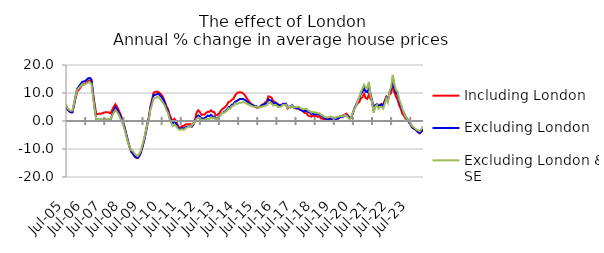
| Category | Including London | Excluding London | Excluding London & SE |
|---|---|---|---|
| 2005-07-01 | 4.961 | 5.238 | 5.911 |
| 2005-08-01 | 3.983 | 4.165 | 4.631 |
| 2005-09-01 | 3.417 | 3.557 | 3.947 |
| 2005-10-01 | 3.107 | 3.169 | 3.642 |
| 2005-11-01 | 3.09 | 3.138 | 3.754 |
| 2005-12-01 | 5.631 | 5.912 | 6.228 |
| 2006-01-01 | 8.047 | 8.723 | 8.703 |
| 2006-02-01 | 10.531 | 11.511 | 11.037 |
| 2006-03-01 | 11.111 | 12.268 | 11.779 |
| 2006-04-01 | 11.953 | 13.012 | 12.348 |
| 2006-05-01 | 12.81 | 13.886 | 13.071 |
| 2006-06-01 | 13.139 | 14.128 | 13.075 |
| 2006-07-01 | 13.316 | 14.248 | 13.034 |
| 2006-08-01 | 13.891 | 14.799 | 13.456 |
| 2006-09-01 | 14.422 | 15.268 | 13.757 |
| 2006-10-01 | 14.497 | 15.359 | 13.773 |
| 2006-11-01 | 14.217 | 14.846 | 13.163 |
| 2006-12-01 | 9.633 | 9.359 | 8.374 |
| 2007-01-01 | 5.843 | 4.658 | 4.228 |
| 2007-02-01 | 2.371 | 0.478 | 0.641 |
| 2007-03-01 | 2.541 | 0.476 | 0.638 |
| 2007-04-01 | 2.587 | 0.482 | 0.648 |
| 2007-05-01 | 2.618 | 0.401 | 0.538 |
| 2007-06-01 | 2.843 | 0.417 | 0.562 |
| 2007-07-01 | 3.018 | 0.44 | 0.592 |
| 2007-08-01 | 3.162 | 0.473 | 0.638 |
| 2007-09-01 | 3.123 | 0.508 | 0.685 |
| 2007-10-01 | 3.04 | 0.484 | 0.653 |
| 2007-11-01 | 2.731 | 0.467 | 0.63 |
| 2007-12-01 | 4.009 | 2.238 | 1.926 |
| 2008-01-01 | 5.111 | 3.72 | 2.966 |
| 2008-02-01 | 6.008 | 4.956 | 3.929 |
| 2008-03-01 | 5.062 | 4.111 | 3.191 |
| 2008-04-01 | 3.943 | 3.113 | 2.352 |
| 2008-05-01 | 2.718 | 2.031 | 1.061 |
| 2008-06-01 | 1.097 | 0.619 | -0.107 |
| 2008-07-01 | -0.669 | -0.966 | -1.674 |
| 2008-08-01 | -2.757 | -2.964 | -3.46 |
| 2008-09-01 | -5.107 | -5.234 | -5.785 |
| 2008-10-01 | -7.441 | -7.566 | -7.899 |
| 2008-11-01 | -9.365 | -9.436 | -9.334 |
| 2008-12-01 | -10.885 | -11.048 | -10.481 |
| 2009-01-01 | -11.686 | -11.713 | -10.732 |
| 2009-02-01 | -12.61 | -12.563 | -11.697 |
| 2009-03-01 | -13.113 | -12.985 | -12.081 |
| 2009-04-01 | -13.269 | -13.148 | -12.561 |
| 2009-05-01 | -12.458 | -12.504 | -11.709 |
| 2009-06-01 | -11.096 | -11.158 | -10.516 |
| 2009-07-01 | -9.065 | -9.217 | -8.438 |
| 2009-08-01 | -6.807 | -6.941 | -6.302 |
| 2009-09-01 | -3.958 | -4.403 | -3.826 |
| 2009-10-01 | -0.942 | -1.376 | -1.102 |
| 2009-11-01 | 1.492 | 0.851 | 0.811 |
| 2009-12-01 | 5.238 | 4.756 | 4.142 |
| 2010-01-01 | 7.6 | 6.892 | 5.896 |
| 2010-02-01 | 10.157 | 9.275 | 8.152 |
| 2010-03-01 | 10.383 | 9.338 | 8.09 |
| 2010-04-01 | 10.489 | 9.558 | 8.582 |
| 2010-05-01 | 10.304 | 9.745 | 8.51 |
| 2010-06-01 | 9.887 | 9.13 | 7.969 |
| 2010-07-01 | 9.322 | 8.534 | 7.107 |
| 2010-08-01 | 8.432 | 7.559 | 6.315 |
| 2010-09-01 | 6.942 | 6.459 | 5.519 |
| 2010-10-01 | 5.263 | 4.666 | 3.91 |
| 2010-11-01 | 4.29 | 3.595 | 2.833 |
| 2010-12-01 | 2.245 | 1.341 | 0.679 |
| 2011-01-01 | 0.943 | 0.139 | -0.7 |
| 2011-02-01 | 0.021 | -0.806 | -1.832 |
| 2011-03-01 | 0.776 | -0.159 | -1.462 |
| 2011-04-01 | 0.092 | -0.883 | -1.76 |
| 2011-05-01 | -1.322 | -2.106 | -2.603 |
| 2011-06-01 | -2.451 | -2.846 | -3.149 |
| 2011-07-01 | -2.22 | -2.722 | -3.048 |
| 2011-08-01 | -1.819 | -2.512 | -2.976 |
| 2011-09-01 | -1.748 | -2.698 | -3.144 |
| 2011-10-01 | -1.236 | -2.252 | -2.598 |
| 2011-11-01 | -1.165 | -2.037 | -2.305 |
| 2011-12-01 | -1.194 | -1.997 | -2.096 |
| 2012-01-01 | -1.114 | -1.839 | -1.752 |
| 2012-02-01 | -1.51 | -2.001 | -1.598 |
| 2012-03-01 | -0.734 | -1.199 | -0.879 |
| 2012-04-01 | 0.693 | -0.184 | -0.465 |
| 2012-05-01 | 3.084 | 1.477 | 0.825 |
| 2012-06-01 | 3.85 | 1.973 | 1.3 |
| 2012-07-01 | 3.186 | 1.548 | 0.902 |
| 2012-08-01 | 2.188 | 0.899 | 0.458 |
| 2012-09-01 | 2.287 | 0.848 | 0.314 |
| 2012-10-01 | 2.314 | 1.012 | 0.512 |
| 2012-11-01 | 2.964 | 1.433 | 0.649 |
| 2012-12-01 | 3.263 | 1.937 | 0.816 |
| 2013-01-01 | 3.304 | 1.69 | 0.666 |
| 2013-02-01 | 3.832 | 2.203 | 1.334 |
| 2013-03-01 | 3.309 | 1.513 | 0.881 |
| 2013-04-01 | 3.147 | 1.63 | 1.212 |
| 2013-05-01 | 2.036 | 0.802 | 0.341 |
| 2013-06-01 | 2.199 | 1.068 | 0.806 |
| 2013-07-01 | 2.706 | 1.585 | 1.428 |
| 2013-08-01 | 3.613 | 2.235 | 2.183 |
| 2013-09-01 | 4.156 | 2.841 | 2.862 |
| 2013-10-01 | 4.638 | 3.119 | 2.84 |
| 2013-11-01 | 5.082 | 3.557 | 3.337 |
| 2013-12-01 | 5.762 | 3.971 | 3.622 |
| 2014-01-01 | 6.864 | 4.935 | 4.562 |
| 2014-02-01 | 6.941 | 4.976 | 4.326 |
| 2014-03-01 | 7.589 | 5.79 | 5.291 |
| 2014-04-01 | 7.863 | 5.967 | 5.364 |
| 2014-05-01 | 9.071 | 6.809 | 6.281 |
| 2014-06-01 | 9.841 | 7.091 | 6.036 |
| 2014-07-01 | 10.166 | 7.457 | 6.269 |
| 2014-08-01 | 10.303 | 7.816 | 6.489 |
| 2014-09-01 | 10.199 | 7.888 | 6.526 |
| 2014-10-01 | 9.912 | 7.859 | 6.787 |
| 2014-11-01 | 9.415 | 7.653 | 6.555 |
| 2014-12-01 | 8.539 | 7.205 | 6.492 |
| 2015-01-01 | 7.563 | 6.721 | 5.968 |
| 2015-02-01 | 6.977 | 6.384 | 5.908 |
| 2015-03-01 | 6.141 | 5.885 | 5.405 |
| 2015-04-01 | 5.843 | 5.659 | 5.256 |
| 2015-05-01 | 5.247 | 5.442 | 5.069 |
| 2015-06-01 | 4.949 | 5.375 | 5.21 |
| 2015-07-01 | 4.72 | 5.094 | 5.064 |
| 2015-08-01 | 4.916 | 5.013 | 4.962 |
| 2015-09-01 | 5.129 | 5.186 | 4.86 |
| 2015-10-01 | 5.82 | 5.737 | 5.131 |
| 2015-11-01 | 5.994 | 5.839 | 5.242 |
| 2015-12-01 | 6.641 | 6.164 | 5.478 |
| 2016-01-01 | 6.987 | 6.279 | 5.608 |
| 2016-02-01 | 8.809 | 7.745 | 6.621 |
| 2016-03-01 | 8.655 | 7.375 | 6.347 |
| 2016-04-01 | 8.33 | 7.231 | 6.295 |
| 2016-05-01 | 7.031 | 6.181 | 5.532 |
| 2016-06-01 | 6.851 | 6.467 | 5.761 |
| 2016-07-01 | 6.508 | 6.312 | 5.507 |
| 2016-08-01 | 5.837 | 5.916 | 4.99 |
| 2016-09-01 | 5.675 | 5.641 | 4.92 |
| 2016-10-01 | 5.615 | 5.587 | 5.166 |
| 2016-11-01 | 6.128 | 5.942 | 5.697 |
| 2016-12-01 | 6.133 | 6.085 | 5.793 |
| 2017-01-01 | 6.071 | 6.183 | 5.786 |
| 2017-02-01 | 4.435 | 4.794 | 4.663 |
| 2017-03-01 | 4.886 | 5.168 | 5.096 |
| 2017-04-01 | 4.886 | 4.989 | 4.887 |
| 2017-05-01 | 5.598 | 5.647 | 5.495 |
| 2017-06-01 | 4.755 | 4.825 | 4.834 |
| 2017-07-01 | 4.54 | 4.697 | 4.927 |
| 2017-08-01 | 4.348 | 4.651 | 5.024 |
| 2017-09-01 | 4.425 | 4.644 | 5.173 |
| 2017-10-01 | 3.949 | 4.035 | 4.603 |
| 2017-11-01 | 3.765 | 3.749 | 4.433 |
| 2017-12-01 | 3.216 | 3.5 | 4.169 |
| 2018-01-01 | 2.903 | 3.574 | 4.28 |
| 2018-02-01 | 2.646 | 3.65 | 4.346 |
| 2018-03-01 | 1.913 | 3.141 | 3.752 |
| 2018-04-01 | 1.761 | 3.04 | 3.567 |
| 2018-05-01 | 1.539 | 2.47 | 2.965 |
| 2018-06-01 | 2.083 | 2.801 | 3.303 |
| 2018-07-01 | 1.713 | 2.387 | 2.966 |
| 2018-08-01 | 1.821 | 2.532 | 3.105 |
| 2018-09-01 | 1.449 | 2.259 | 2.714 |
| 2018-10-01 | 1.647 | 2.441 | 2.786 |
| 2018-11-01 | 0.913 | 1.937 | 2.192 |
| 2018-12-01 | 0.855 | 1.607 | 2.052 |
| 2019-01-01 | 0.572 | 1.041 | 1.499 |
| 2019-02-01 | 0.744 | 0.834 | 1.344 |
| 2019-03-01 | 0.702 | 0.675 | 1.225 |
| 2019-04-01 | 0.698 | 0.571 | 1.355 |
| 2019-05-01 | 0.999 | 0.864 | 1.639 |
| 2019-06-01 | 0.812 | 0.661 | 1.216 |
| 2019-07-01 | 0.982 | 0.907 | 1.34 |
| 2019-08-01 | 0.645 | 0.582 | 1.038 |
| 2019-09-01 | 0.918 | 0.906 | 1.531 |
| 2019-10-01 | 0.912 | 0.941 | 1.475 |
| 2019-11-01 | 1.564 | 1.463 | 1.824 |
| 2019-12-01 | 1.694 | 1.446 | 1.601 |
| 2020-01-01 | 2.021 | 1.538 | 1.707 |
| 2020-02-01 | 2.345 | 1.941 | 2.115 |
| 2020-03-01 | 2.613 | 2.185 | 1.948 |
| 2020-04-01 | 1.892 | 1.665 | 1.137 |
| 2020-05-01 | 1.017 | 0.963 | 0.538 |
| 2020-06-01 | 1.271 | 1.303 | 1.485 |
| 2020-07-01 | 2.85 | 2.762 | 2.95 |
| 2020-08-01 | 4.627 | 4.425 | 4.311 |
| 2020-09-01 | 5.441 | 5.7 | 5.39 |
| 2020-10-01 | 6.341 | 7.072 | 6.996 |
| 2020-11-01 | 6.728 | 8.176 | 8.503 |
| 2020-12-01 | 8.075 | 9.707 | 10.296 |
| 2021-01-01 | 8.549 | 10.51 | 11.537 |
| 2021-02-01 | 9.731 | 11.739 | 12.956 |
| 2021-03-01 | 8.173 | 10.512 | 12.147 |
| 2021-04-01 | 7.892 | 10.294 | 11.69 |
| 2021-05-01 | 9.442 | 12.485 | 13.968 |
| 2021-06-01 | 8.045 | 9.705 | 9.595 |
| 2021-07-01 | 6.97 | 7.627 | 6.954 |
| 2021-08-01 | 3.846 | 3.874 | 2.956 |
| 2021-09-01 | 5.443 | 5.633 | 5.078 |
| 2021-10-01 | 5.71 | 6.026 | 5.767 |
| 2021-11-01 | 5.582 | 5.155 | 4.37 |
| 2021-12-01 | 5.867 | 5.624 | 5.045 |
| 2022-01-01 | 6.077 | 5.928 | 4.943 |
| 2022-02-01 | 5.747 | 5.271 | 4.416 |
| 2022-03-01 | 7.322 | 6.772 | 6.066 |
| 2022-04-01 | 8.713 | 8.324 | 8.003 |
| 2022-05-01 | 7.888 | 7.348 | 6.624 |
| 2022-06-01 | 9.444 | 10.261 | 10.551 |
| 2022-07-01 | 9.951 | 11.399 | 12.268 |
| 2022-08-01 | 12.705 | 14.828 | 16.463 |
| 2022-09-01 | 10.363 | 11.969 | 13.167 |
| 2022-10-01 | 8.718 | 10.173 | 11.033 |
| 2022-11-01 | 7.666 | 9.46 | 10.507 |
| 2022-12-01 | 5.681 | 7.241 | 7.861 |
| 2023-01-01 | 4.441 | 5.66 | 6.276 |
| 2023-02-01 | 2.681 | 3.932 | 4.392 |
| 2023-03-01 | 1.891 | 2.973 | 3.008 |
| 2023-04-01 | 0.906 | 1.668 | 1.541 |
| 2023-05-01 | 0.554 | 0.865 | 0.904 |
| 2023-06-01 | -0.274 | -0.318 | -0.045 |
| 2023-07-01 | -1.202 | -0.964 | -0.575 |
| 2023-08-01 | -2.188 | -2.036 | -1.727 |
| 2023-09-01 | -2.646 | -2.582 | -2.178 |
| 2023-10-01 | -2.918 | -2.982 | -2.669 |
| 2023-11-01 | -3.465 | -3.431 | -3.141 |
| 2023-12-01 | -4.041 | -3.929 | -3.358 |
| 2024-01-01 | -4.409 | -4.313 | -3.636 |
| 2024-02-01 | -3.883 | -3.631 | -2.837 |
| 2024-03-01 | -3.139 | -2.954 | -1.913 |